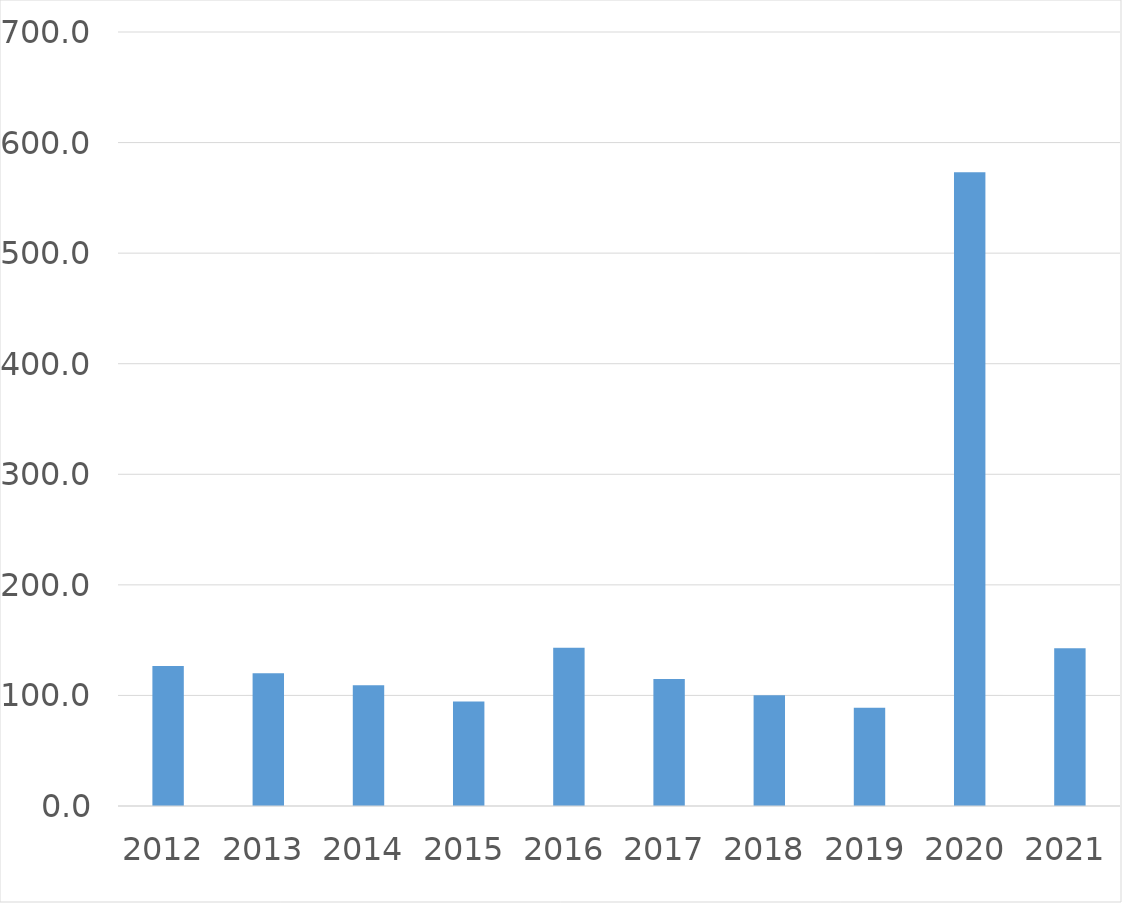
| Category | Series 0 |
|---|---|
| 2012 | 126.7 |
| 2013 | 120 |
| 2014 | 109.1 |
| 2015 | 94.6 |
| 2016 | 143.2 |
| 2017 | 114.8 |
| 2018 | 100.1 |
| 2019 | 88.9 |
| 2020 | 573.1 |
| 2021 | 142.7 |